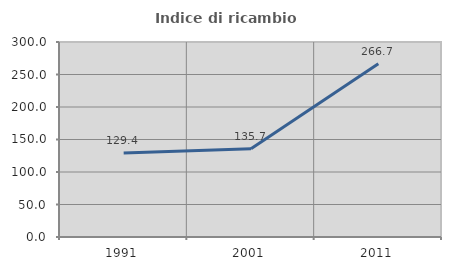
| Category | Indice di ricambio occupazionale  |
|---|---|
| 1991.0 | 129.412 |
| 2001.0 | 135.714 |
| 2011.0 | 266.667 |